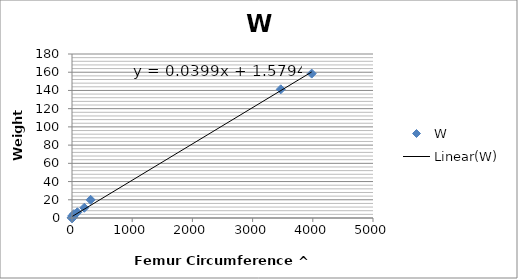
| Category | W |
|---|---|
| 0.501133790807 | 0.083 |
| 0.354744554039 | 0.091 |
| 1.0 | 0.141 |
| 1.4124678480000006 | 0.246 |
| 4.897410518168 | 0.282 |
| 1.7379550561669996 | 0.794 |
| 7.943732436177001 | 2.512 |
| 11.219866714603002 | 1.412 |
| 15.849188760158997 | 0.891 |
| 15.849188760158997 | 1.995 |
| 31.623446801367002 | 4.266 |
| 89.122943645632 | 6.31 |
| 204.16999215110397 | 11.22 |
| 309.025463219712 | 19.95 |
| 3467.6348354559996 | 141.25 |
| 3981.876625 | 158.489 |